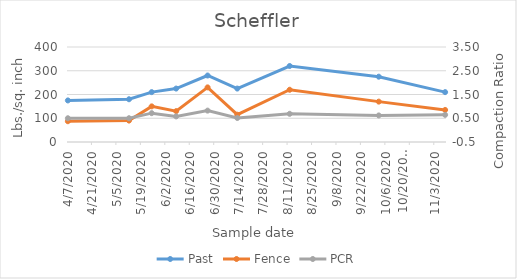
| Category | Past | Fence |
|---|---|---|
| 4/7/20 | 175 | 87.5 |
| 5/12/20 | 180 | 90.2 |
| 5/25/20 | 210 | 150 |
| 6/8/20 | 225 | 130 |
| 6/26/20 | 280 | 230 |
| 7/13/20 | 225 | 115 |
| 8/12/20 | 320 | 220 |
| 10/2/20 | 275 | 170 |
| 11/9/20 | 210 | 135 |